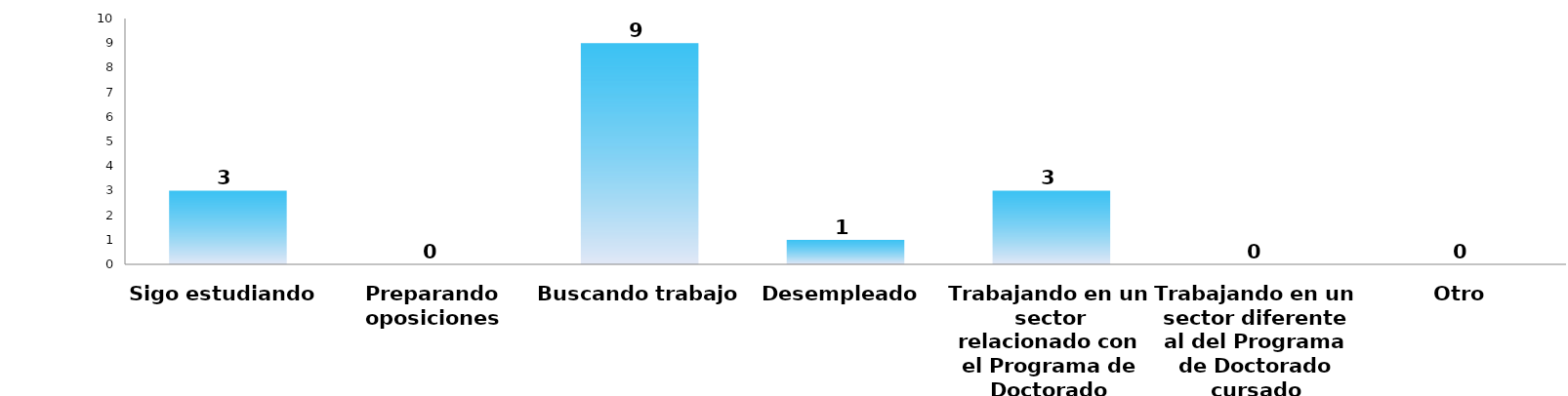
| Category | Series 0 |
|---|---|
| Sigo estudiando | 3 |
| Preparando oposiciones | 0 |
| Buscando trabajo | 9 |
| Desempleado | 1 |
| Trabajando en un sector relacionado con el Programa de Doctorado cursado | 3 |
| Trabajando en un sector diferente al del Programa de Doctorado cursado | 0 |
| Otro | 0 |